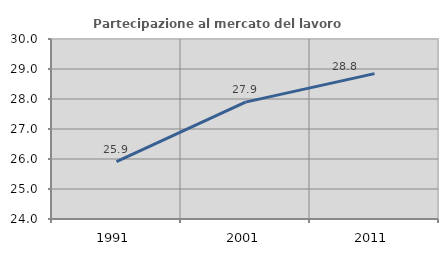
| Category | Partecipazione al mercato del lavoro  femminile |
|---|---|
| 1991.0 | 25.909 |
| 2001.0 | 27.895 |
| 2011.0 | 28.846 |